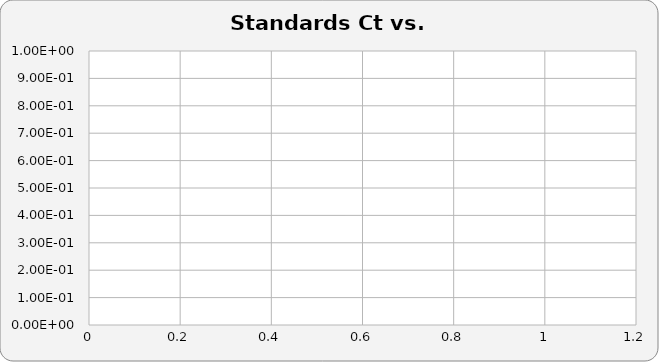
| Category | Series 0 |
|---|---|
|  | 0 |
|  | 0 |
|  | 0 |
|  | 0 |
|  | 0 |
|  | 0 |
|  | 0 |
|  | 0 |
|  | 0 |
|  | 0 |
|  | 0 |
|  | 0 |
|  | 0 |
|  | 0 |
|  | 0 |
|  | 0 |
|  | 0 |
|  | 0 |
|  | 0 |
|  | 0 |
|  | 0 |
|  | 0 |
|  | 0 |
|  | 0 |